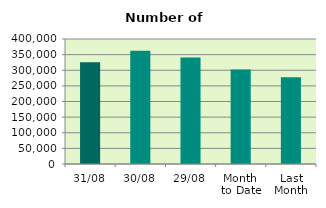
| Category | Series 0 |
|---|---|
| 31/08 | 325254 |
| 30/08 | 362344 |
| 29/08 | 341036 |
| Month 
to Date | 302693.565 |
| Last
Month | 277312.476 |